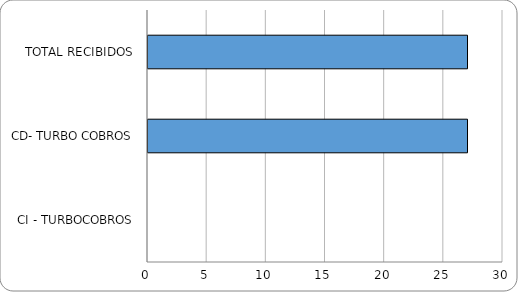
| Category | Series 0 |
|---|---|
| TOTAL RECIBIDOS | 27 |
| CD- TURBO COBROS | 27 |
| CI - TURBOCOBROS | 0 |